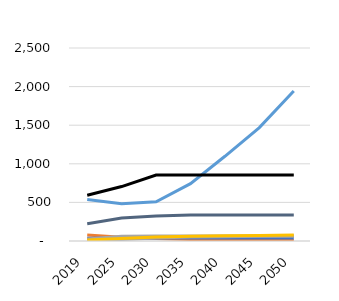
| Category | liquids | natural gas | coal | nuclear | hydro | other | wind | solar |
|---|---|---|---|---|---|---|---|---|
| 2019.0 | 77.92 | 538.19 | 593.2 | 37.21 | 224.79 | 26.84 | 9.54 | 11.95 |
| 2025.0 | 47.72 | 481.28 | 705.24 | 37.27 | 296.98 | 61.18 | 20.01 | 32.85 |
| 2030.0 | 31.63 | 508.18 | 855.41 | 37.27 | 324.8 | 65.65 | 39.37 | 50.28 |
| 2035.0 | 20.73 | 742.34 | 855.41 | 37.27 | 335.23 | 65.79 | 50.31 | 60.8 |
| 2040.0 | 13.36 | 1097.3 | 855.41 | 37.27 | 335.34 | 65.9 | 55.06 | 66.51 |
| 2045.0 | 8.36 | 1469.24 | 855.41 | 37.27 | 335.34 | 66.02 | 60 | 71.44 |
| 2050.0 | 4.97 | 1943.32 | 855.41 | 37.27 | 335.34 | 66.16 | 65.85 | 76.52 |